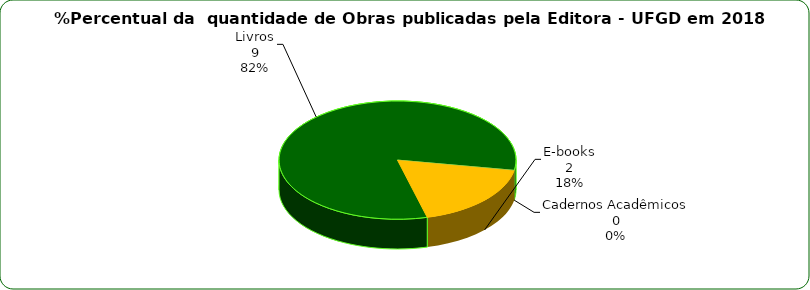
| Category | Series 0 |
|---|---|
| 0 | 2 |
| 1 | 9 |
| 2 | 0 |